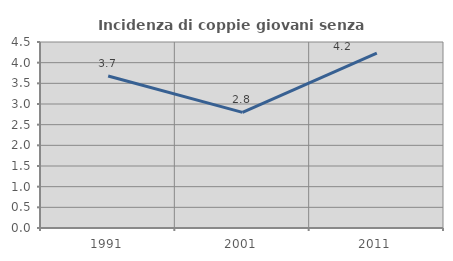
| Category | Incidenza di coppie giovani senza figli |
|---|---|
| 1991.0 | 3.678 |
| 2001.0 | 2.797 |
| 2011.0 | 4.233 |